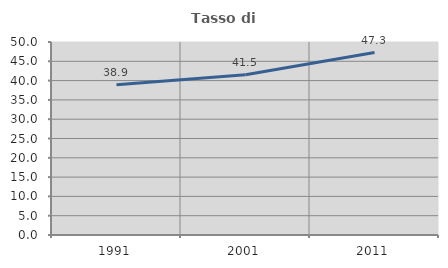
| Category | Tasso di occupazione   |
|---|---|
| 1991.0 | 38.92 |
| 2001.0 | 41.512 |
| 2011.0 | 47.255 |